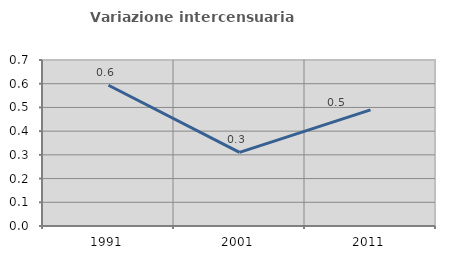
| Category | Variazione intercensuaria annua |
|---|---|
| 1991.0 | 0.594 |
| 2001.0 | 0.311 |
| 2011.0 | 0.49 |